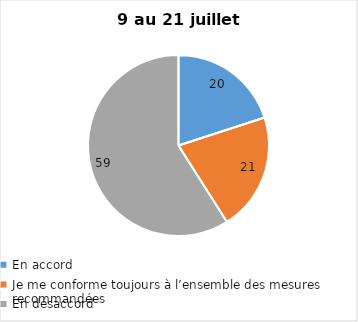
| Category | Series 0 |
|---|---|
| En accord | 20 |
| Je me conforme toujours à l’ensemble des mesures recommandées | 21 |
| En désaccord | 59 |